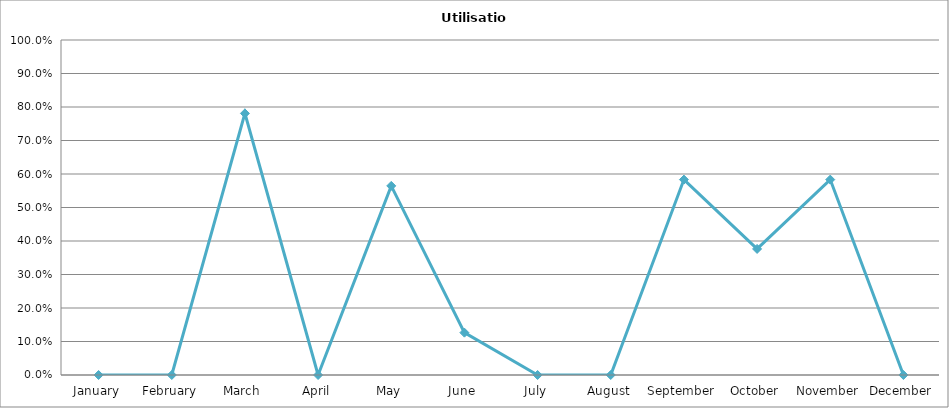
| Category | Number |
|---|---|
| January | 0 |
| February | 0 |
| March | 0.781 |
| April | 0 |
| May | 0.565 |
| June | 0.126 |
| July | 0 |
| August | 0 |
| September | 0.583 |
| October | 0.376 |
| November | 0.583 |
| December | 0 |